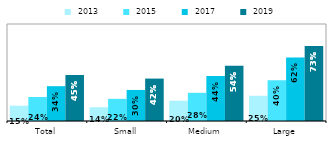
| Category |  2013 |  2015 |  2017 |  2019 |
|---|---|---|---|---|
| Total | 0.15 | 0.235 | 0.341 | 0.45 |
| Small | 0.135 | 0.217 | 0.304 | 0.415 |
| Medium | 0.199 | 0.276 | 0.441 | 0.541 |
| Large | 0.247 | 0.399 | 0.623 | 0.733 |